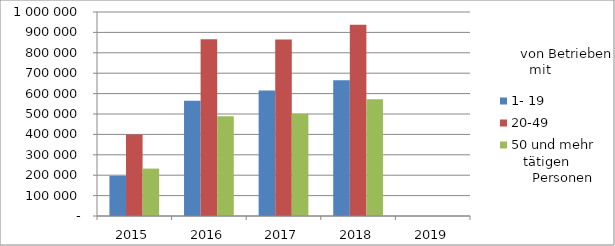
| Category | 1- 19 | 20-49 | 50 und mehr |
|---|---|---|---|
| 2015.0 | 196941.16 | 399161.973 | 232434.682 |
| 2016.0 | 564927.004 | 866402.513 | 488953.198 |
| 2017.0 | 614803.76 | 865068.807 | 500968.958 |
| 2018.0 | 664851.298 | 937490.312 | 572802.95 |
| 2019.0 | 0 | 0 | 0 |